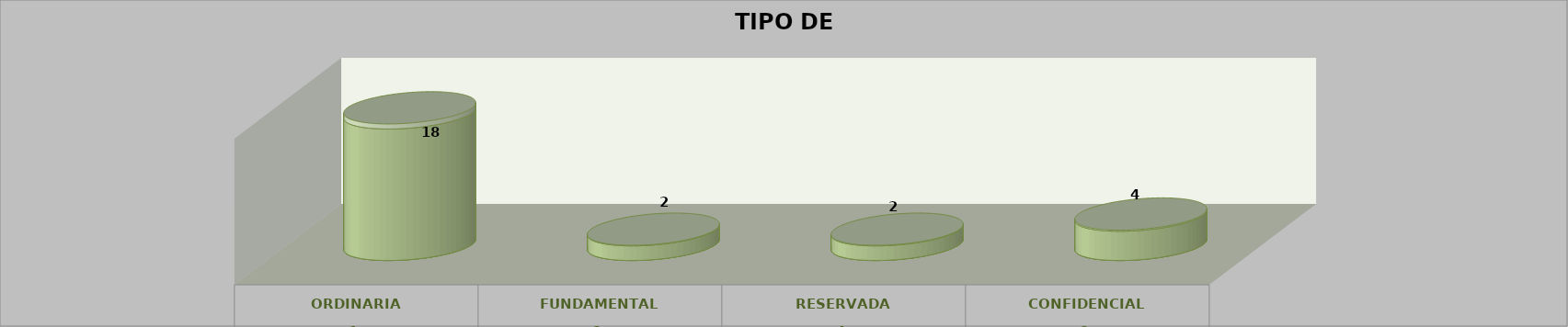
| Category | Series 0 | Series 2 | Series 1 | Series 3 | Series 4 |
|---|---|---|---|---|---|
| 0 |  |  |  | 18 | 0.692 |
| 1 |  |  |  | 2 | 0.077 |
| 2 |  |  |  | 2 | 0.077 |
| 3 |  |  |  | 4 | 0.154 |